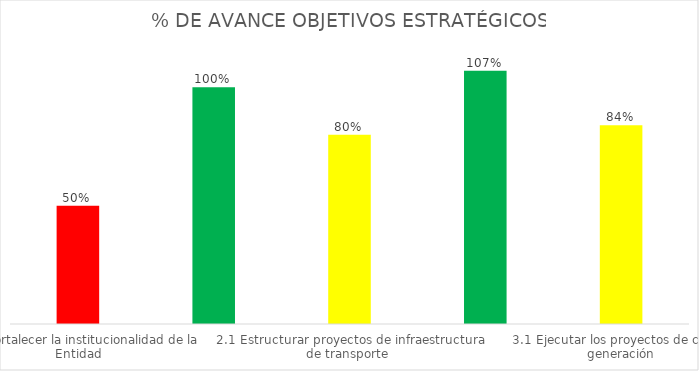
| Category | Series 1 |
|---|---|
| 1.1  Fortalecer la institucionalidad de la Entidad | 0.5 |
| 1.2 Generar confianza en los ciudadanos, Estado e inversionistas | 1 |
| 2.1 Estructurar proyectos de infraestructura de transporte  | 0.8 |
| 2.2 Gestionar la ejecución de los  proyectos de infraestructura  de transporte | 1.07 |
| 3.1 Ejecutar los proyectos de cuarta generación | 0.84 |